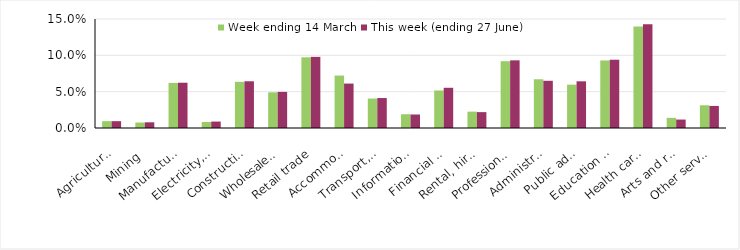
| Category | Week ending 14 March | This week (ending 27 June) |
|---|---|---|
| Agriculture, forestry and fishing | 0.009 | 0.009 |
| Mining | 0.008 | 0.008 |
| Manufacturing | 0.062 | 0.062 |
| Electricity, gas, water and waste services | 0.008 | 0.009 |
| Construction | 0.064 | 0.064 |
| Wholesale trade | 0.049 | 0.05 |
| Retail trade | 0.097 | 0.098 |
| Accommodation and food services | 0.072 | 0.061 |
| Transport, postal and warehousing | 0.041 | 0.041 |
| Information media and telecommunications | 0.019 | 0.019 |
| Financial and insurance services | 0.052 | 0.055 |
| Rental, hiring and real estate services | 0.022 | 0.022 |
| Professional, scientific and technical services | 0.092 | 0.093 |
| Administrative and support services | 0.067 | 0.065 |
| Public administration and safety | 0.06 | 0.064 |
| Education and training | 0.093 | 0.094 |
| Health care and social assistance | 0.14 | 0.143 |
| Arts and recreation services | 0.014 | 0.012 |
| Other services | 0.031 | 0.03 |